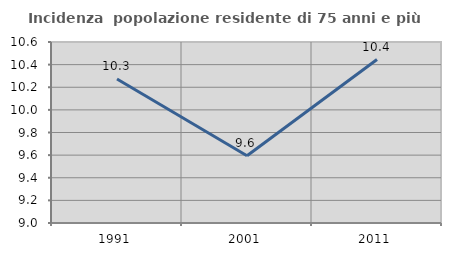
| Category | Incidenza  popolazione residente di 75 anni e più |
|---|---|
| 1991.0 | 10.273 |
| 2001.0 | 9.595 |
| 2011.0 | 10.445 |